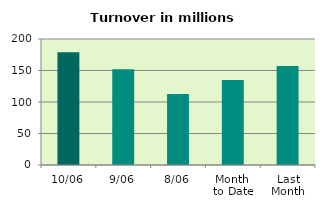
| Category | Series 0 |
|---|---|
| 10/06 | 179.038 |
| 9/06 | 152.149 |
| 8/06 | 112.759 |
| Month 
to Date | 135.023 |
| Last
Month | 157.265 |